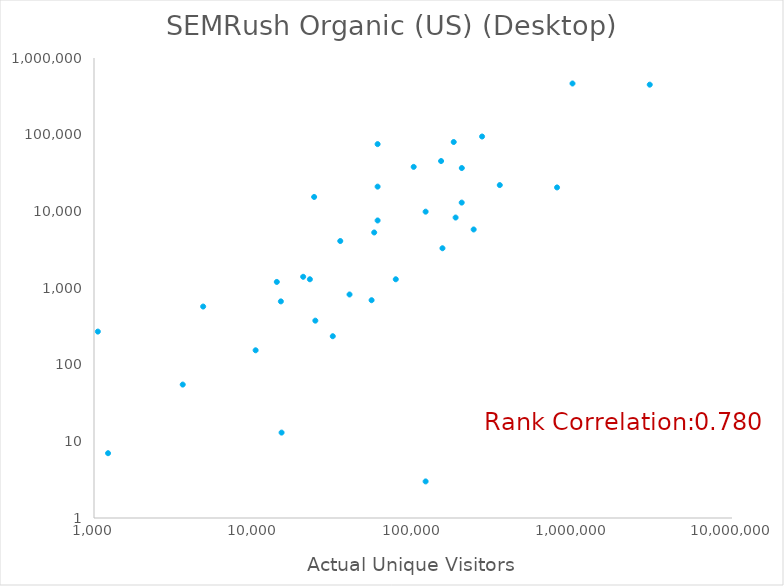
| Category | SEMRush Organic (US) (Desktop) |
|---|---|
| 57127.0 | 5300 |
| 14843.0 | 669 |
| 120000.0 | 9900 |
| 24000.0 | 15400 |
| 3600.0 | 55 |
| 150000.0 | 45300 |
| 185000.0 | 8300 |
| 240080.0 | 5800 |
| 31412.0 | 235 |
| 22569.0 | 1300 |
| 153037.0 | 3300 |
| 78000.0 | 1300 |
| 202000.0 | 13000 |
| 24417.0 | 375 |
| 60000.0 | 7600 |
| 35000.0 | 4100 |
| 1000000.0 | 465000 |
| 350000.0 | 22000 |
| 20485.0 | 1400 |
| 271059.0 | 94600 |
| 101000.0 | 38000 |
| 800000.0 | 20500 |
| 60000.0 | 21000 |
| 180000.0 | 80200 |
| 15000.0 | 13 |
| 14000.0 | 1200 |
| 55000.0 | 693 |
| 1057.0 | 270 |
| 10313.0 | 154 |
| 1225.0 | 7 |
| 60000.0 | 75300 |
| 6790.0 | 0 |
| 202310.0 | 36700 |
| 40000.0 | 823 |
| 120000.0 | 3 |
| 3050000.0 | 449000 |
| 4835.0 | 573 |